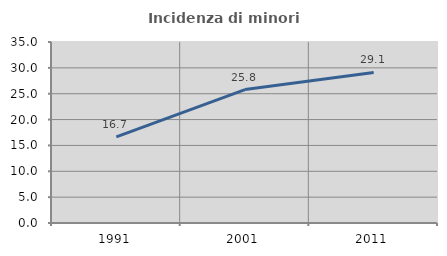
| Category | Incidenza di minori stranieri |
|---|---|
| 1991.0 | 16.667 |
| 2001.0 | 25.806 |
| 2011.0 | 29.124 |